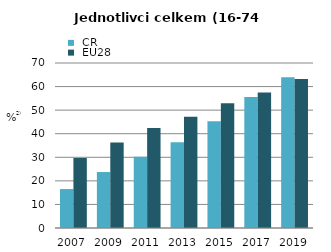
| Category |  ČR |  EU28 |
|---|---|---|
| 2007.0 | 16.527 | 29.719 |
| 2009.0 | 23.742 | 36.307 |
| 2011.0 | 30.187 | 42.432 |
| 2013.0 | 36.392 | 47.21 |
| 2015.0 | 45.325 | 52.954 |
| 2017.0 | 55.585 | 57.456 |
| 2019.0 | 64 | 63.2 |